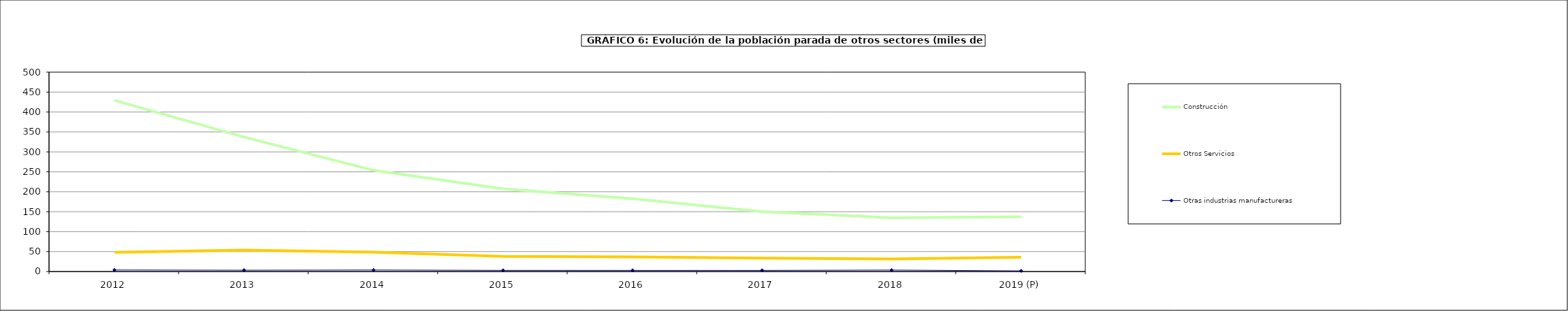
| Category | Construcción | Otros Servicios | Otras industrias manufactureras |
|---|---|---|---|
| 2012 | 429.35 | 48.3 | 3.85 |
| 2013 | 337.3 | 53.6 | 3.3 |
| 2014 | 253.7 | 48.725 | 3.775 |
| 2015 | 207.3 | 38 | 2.9 |
| 2016 | 182.7 | 36.7 | 2.8 |
| 2017 | 150.3 | 33.7 | 2.8 |
| 2018 | 134.825 | 31.575 | 3.6 |
| 2019 (P) | 137.35 | 35.9 | 1.55 |